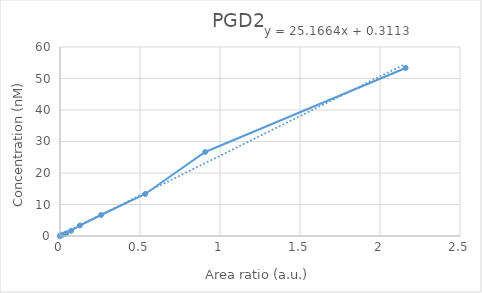
| Category | PGD2 |
|---|---|
| 0.0 | 0 |
| 0.00119728275184988 | 0.208 |
| 0.0168376277173951 | 0.417 |
| 0.0379224497402425 | 0.833 |
| 0.0696540675276652 | 1.667 |
| 0.124286565098944 | 3.333 |
| 0.256733165940009 | 6.667 |
| 0.532157355219974 | 13.333 |
| 0.907382270672396 | 26.667 |
| 2.16032622241693 | 53.333 |